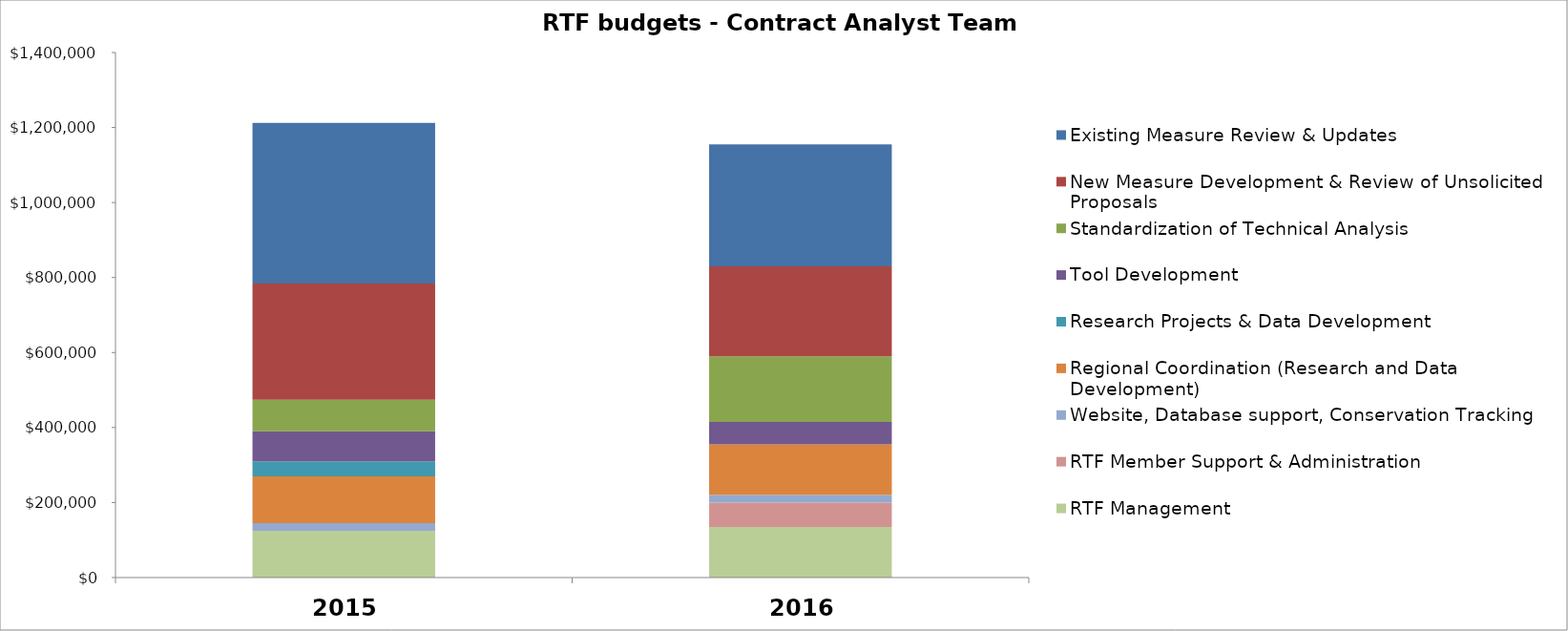
| Category | RTF Management | RTF Member Support & Administration | Website, Database support, Conservation Tracking  | Regional Coordination (Research and Data Development) | Research Projects & Data Development | Tool Development | Standardization of Technical Analysis | New Measure Development & Review of Unsolicited Proposals | Existing Measure Review & Updates |
|---|---|---|---|---|---|---|---|---|---|
| 0 | 125000 | 0 | 20000 | 125000 | 40000 | 80000 | 84000 | 310000 | 428000 |
| 1 | 135000 | 65000 | 20000 | 135000 | 0 | 60000 | 175000 | 240000 | 325000 |